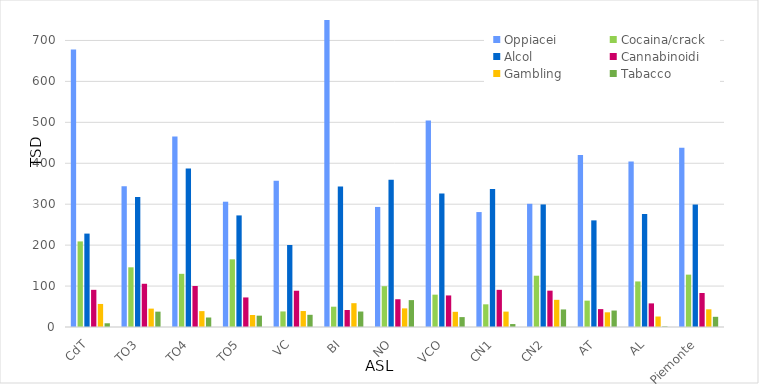
| Category | Oppiacei | Cocaina/crack | Alcol | Cannabinoidi | Gambling | Tabacco |
|---|---|---|---|---|---|---|
| CdT | 677.8 | 209.1 | 228.2 | 90.8 | 56.3 | 9.1 |
| TO3 | 343.7 | 145.8 | 317.4 | 105.6 | 44.9 | 37.5 |
| TO4 | 465.6 | 129.9 | 387.5 | 100.2 | 38.8 | 23.2 |
| TO5 | 306.1 | 165.3 | 272.6 | 72.2 | 29.3 | 27.7 |
| VC | 357.3 | 38 | 200.4 | 88.6 | 39 | 29.8 |
| BI | 768.9 | 49.6 | 343.4 | 41.5 | 58.2 | 37.8 |
| NO | 293.3 | 99.7 | 359.7 | 67.8 | 45.5 | 65.7 |
| VCO | 504.3 | 79 | 326.3 | 77.1 | 37.1 | 24.2 |
| CN1 | 280.8 | 55.4 | 337 | 90.8 | 37.6 | 7.2 |
| CN2 | 301 | 125.3 | 299.4 | 88.8 | 66.4 | 42.9 |
| AT | 420.2 | 64.4 | 260.5 | 43.7 | 35.9 | 40.2 |
| AL | 404.1 | 111.3 | 276.1 | 57.7 | 25.6 | 1.4 |
| Piemonte | 438 | 127.9 | 299.2 | 83 | 43.2 | 24.9 |